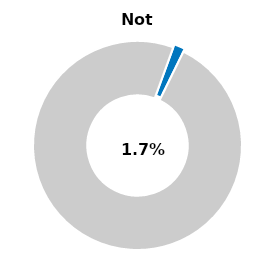
| Category | Series 0 |
|---|---|
| Not passed | 0.017 |
| Other | 0.983 |